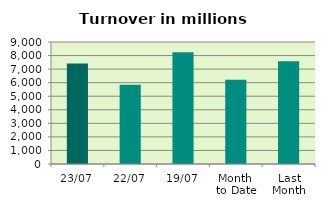
| Category | Series 0 |
|---|---|
| 23/07 | 7412.889 |
| 22/07 | 5846.675 |
| 19/07 | 8235.294 |
| Month 
to Date | 6223.348 |
| Last
Month | 7579.876 |